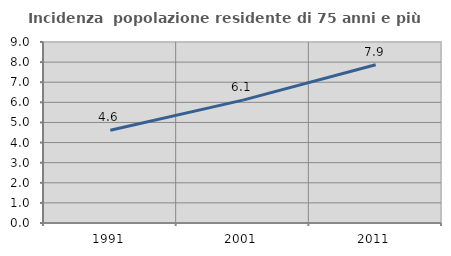
| Category | Incidenza  popolazione residente di 75 anni e più |
|---|---|
| 1991.0 | 4.615 |
| 2001.0 | 6.11 |
| 2011.0 | 7.869 |